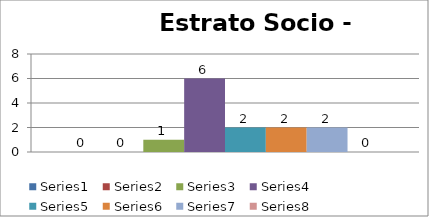
| Category | Series 0 | Series 1 | Series 2 | Series 3 | Series 4 | Series 5 | Series 6 | Series 7 |
|---|---|---|---|---|---|---|---|---|
| 0 | 0 | 0 | 1 | 6 | 2 | 2 | 2 | 0 |